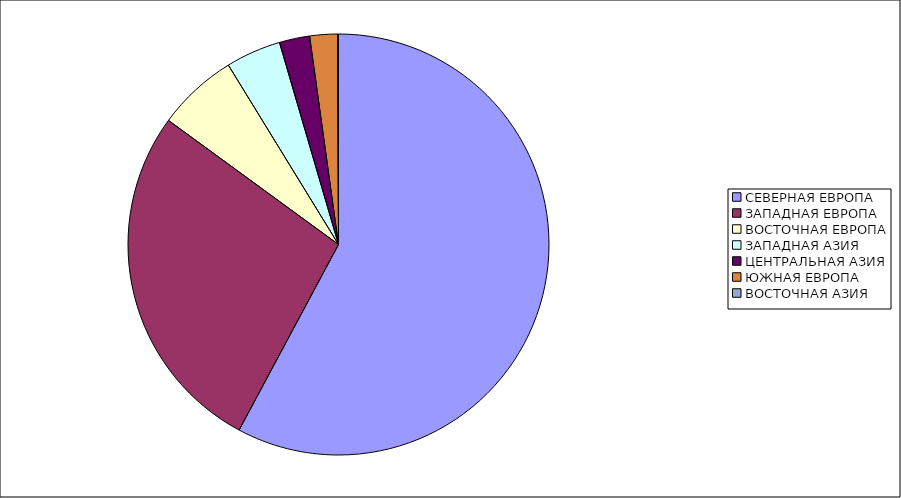
| Category | Оборот |
|---|---|
| СЕВЕРНАЯ ЕВРОПА | 57.825 |
| ЗАПАДНАЯ ЕВРОПА | 27.209 |
| ВОСТОЧНАЯ ЕВРОПА | 6.2 |
| ЗАПАДНАЯ АЗИЯ | 4.241 |
| ЦЕНТРАЛЬНАЯ АЗИЯ | 2.33 |
| ЮЖНАЯ ЕВРОПА | 2.119 |
| ВОСТОЧНАЯ АЗИЯ | 0.075 |